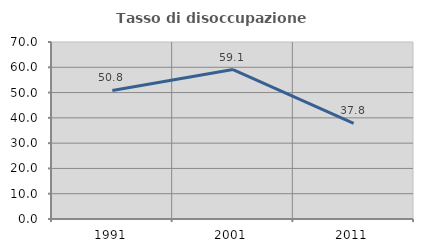
| Category | Tasso di disoccupazione giovanile  |
|---|---|
| 1991.0 | 50.82 |
| 2001.0 | 59.091 |
| 2011.0 | 37.838 |